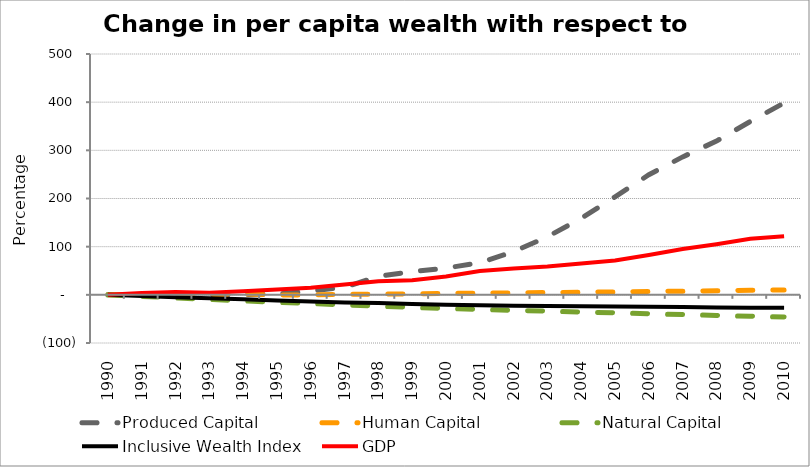
| Category | Produced Capital  | Human Capital | Natural Capital | Inclusive Wealth Index | GDP |
|---|---|---|---|---|---|
| 1990.0 | 0 | 0 | 0 | 0 | 0 |
| 1991.0 | -1.615 | 0.228 | -3.185 | -2.43 | 3.966 |
| 1992.0 | -1.142 | 0.439 | -6.354 | -4.818 | 5.961 |
| 1993.0 | -0.978 | 0.61 | -9.473 | -7.18 | 4.259 |
| 1994.0 | 0.454 | 2.104 | -12.499 | -9.168 | 7.647 |
| 1995.0 | 1.854 | -0.658 | -15.408 | -11.977 | 11.172 |
| 1996.0 | 8.009 | 0.152 | -18.209 | -13.864 | 14.753 |
| 1997.0 | 15.802 | 0.787 | -20.915 | -15.688 | 21.628 |
| 1998.0 | 38.281 | 1.471 | -23.514 | -17.188 | 28.354 |
| 1999.0 | 48.466 | 2.182 | -26.027 | -18.81 | 30.504 |
| 2000.0 | 55.558 | 2.897 | -28.481 | -20.434 | 38.058 |
| 2001.0 | 66.693 | 3.449 | -30.344 | -21.575 | 49.415 |
| 2002.0 | 89.608 | 4.067 | -32.136 | -22.46 | 54.769 |
| 2003.0 | 120.504 | 4.731 | -33.888 | -23.179 | 58.791 |
| 2004.0 | 158.953 | 5.422 | -35.655 | -23.783 | 65.164 |
| 2005.0 | 203.575 | 6.118 | -37.421 | -24.288 | 71.138 |
| 2006.0 | 249.302 | 6.832 | -39.199 | -24.781 | 82.664 |
| 2007.0 | 286.348 | 7.621 | -40.998 | -25.412 | 95.128 |
| 2008.0 | 319.293 | 8.447 | -42.767 | -26.076 | 105.02 |
| 2009.0 | 359.874 | 9.274 | -44.479 | -26.576 | 116.28 |
| 2010.0 | 398.476 | 10.074 | -46.132 | -27.068 | 121.636 |